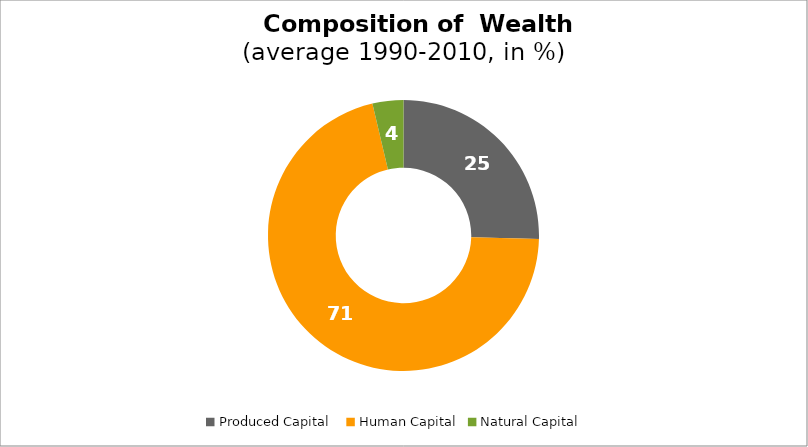
| Category | Series 0 |
|---|---|
| Produced Capital  | 25.425 |
| Human Capital | 70.886 |
| Natural Capital | 3.689 |